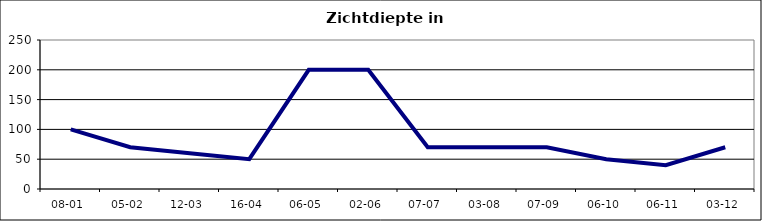
| Category | Zichtdiepte in cm |
|---|---|
| 08-01 | 100 |
| 05-02 | 70 |
| 12-03 | 60 |
| 16-04 | 50 |
| 06-05 | 200 |
| 02-06 | 200 |
| 07-07 | 70 |
| 03-08 | 70 |
| 07-09 | 70 |
| 06-10 | 50 |
| 06-11 | 40 |
| 03-12 | 70 |